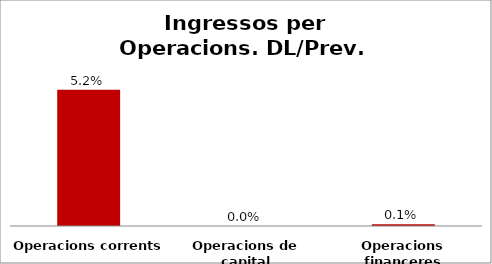
| Category | Series 0 |
|---|---|
| Operacions corrents | 0.052 |
| Operacions de capital | 0 |
| Operacions financeres | 0.001 |